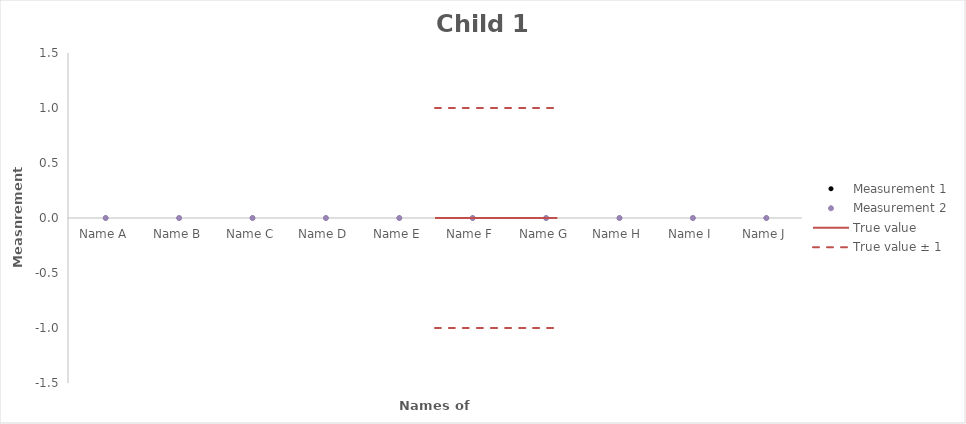
| Category | Measurement 1 | Measurement 2 |
|---|---|---|
| Name A | 0 | 0 |
| Name B | 0 | 0 |
| Name C | 0 | 0 |
| Name D | 0 | 0 |
| Name E | 0 | 0 |
| Name F | 0 | 0 |
| Name G | 0 | 0 |
| Name H | 0 | 0 |
| Name I | 0 | 0 |
| Name J | 0 | 0 |